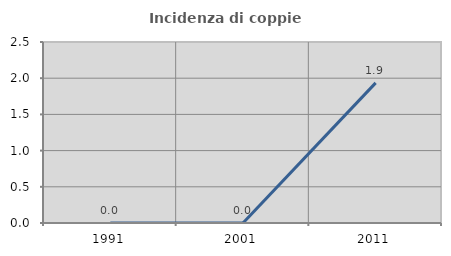
| Category | Incidenza di coppie miste |
|---|---|
| 1991.0 | 0 |
| 2001.0 | 0 |
| 2011.0 | 1.935 |